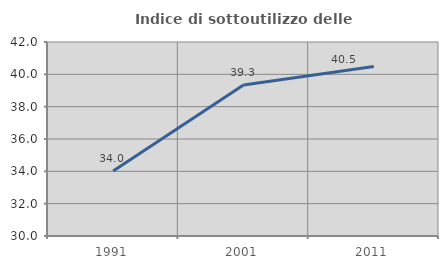
| Category | Indice di sottoutilizzo delle abitazioni  |
|---|---|
| 1991.0 | 34.013 |
| 2001.0 | 39.337 |
| 2011.0 | 40.485 |